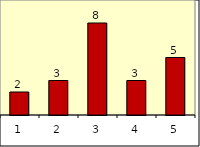
| Category | Series 1 |
|---|---|
| 0 | 2 |
| 1 | 3 |
| 2 | 8 |
| 3 | 3 |
| 4 | 5 |